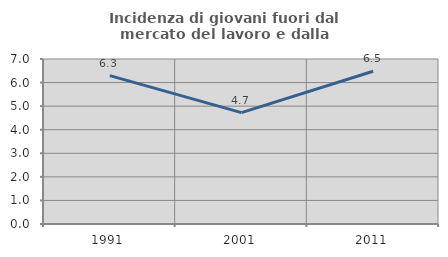
| Category | Incidenza di giovani fuori dal mercato del lavoro e dalla formazione  |
|---|---|
| 1991.0 | 6.295 |
| 2001.0 | 4.724 |
| 2011.0 | 6.48 |